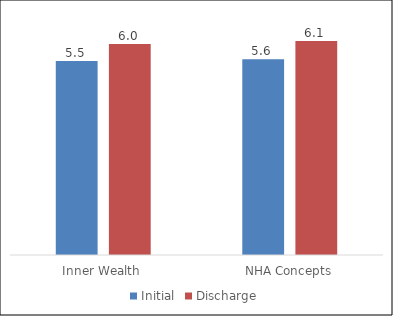
| Category | Initial | Discharge |
|---|---|---|
| Inner Wealth | 5.542 | 6.028 |
| NHA Concepts | 5.595 | 6.117 |